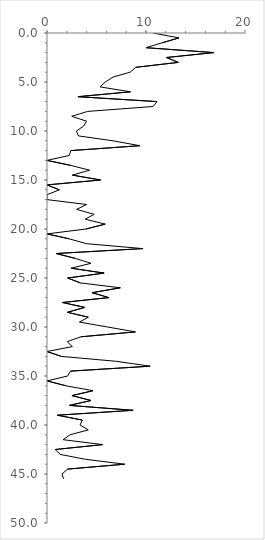
| Category | Series 0 |
|---|---|
| 10.695187165775401 | 0 |
| 13.333333333333334 | 0.5 |
| 11.627906976744185 | 1 |
| 10.0 | 1.5 |
| 16.867469879518072 | 2 |
| 12.068965517241379 | 2.5 |
| 13.26530612244898 | 3 |
| 8.974358974358974 | 3.5 |
| 8.396946564885496 | 4 |
| 6.666666666666667 | 4.5 |
| 5.88235294117647 | 5 |
| 5.357142857142857 | 5.5 |
| 8.433734939759036 | 6 |
| 3.125 | 6.5 |
| 11.11111111111111 | 7 |
| 10.714285714285714 | 7.5 |
| 4.10958904109589 | 8 |
| 2.5 | 8.5 |
| 4.0 | 9 |
| 3.7037037037037033 | 9.5 |
| 2.9702970297029703 | 10 |
| 3.1746031746031744 | 10.5 |
| 6.666666666666667 | 11 |
| 9.375 | 11.5 |
| 2.4096385542168677 | 12 |
| 2.247191011235955 | 12.5 |
| 0.0 | 13 |
| 2.3529411764705883 | 13.5 |
| 4.310344827586207 | 14 |
| 2.564102564102564 | 14.5 |
| 5.405405405405405 | 15 |
| 0.0 | 15.5 |
| 1.25 | 16 |
| 0.0 | 16.5 |
| 0.0 | 17 |
| 4.0 | 17.5 |
| 2.9850746268656714 | 18 |
| 4.761904761904762 | 18.5 |
| 3.8461538461538463 | 19 |
| 5.88235294117647 | 19.5 |
| 3.937007874015748 | 20 |
| 0.0 | 20.5 |
| 2.2222222222222223 | 21 |
| 4.0 | 21.5 |
| 9.67741935483871 | 22 |
| 0.9259259259259258 | 22.5 |
| 2.857142857142857 | 23 |
| 4.444444444444445 | 23.5 |
| 2.4390243902439024 | 24 |
| 5.769230769230769 | 24.5 |
| 2.083333333333333 | 25 |
| 3.3707865168539324 | 25.5 |
| 7.4074074074074066 | 26 |
| 4.545454545454546 | 26.5 |
| 6.25 | 27 |
| 1.5625 | 27.5 |
| 3.8095238095238098 | 28 |
| 2.0689655172413794 | 28.5 |
| 4.166666666666666 | 29 |
| 3.278688524590164 | 29.5 |
| 6.122448979591836 | 30 |
| 8.928571428571429 | 30.5 |
| 3.4090909090909087 | 31 |
| 2.0408163265306123 | 31.5 |
| 2.564102564102564 | 32 |
| 0.0 | 32.5 |
| 1.4492753623188406 | 33 |
| 7.000000000000001 | 33.5 |
| 10.416666666666668 | 34 |
| 2.380952380952381 | 34.5 |
| 2.083333333333333 | 35 |
| 0.0 | 35.5 |
| 1.9230769230769231 | 36 |
| 4.651162790697675 | 36.5 |
| 2.5210084033613445 | 37 |
| 4.444444444444445 | 37.5 |
| 2.2556390977443606 | 38 |
| 8.695652173913043 | 38.5 |
| 1.0526315789473684 | 39 |
| 3.571428571428571 | 39.5 |
| 3.3333333333333335 | 40 |
| 4.166666666666666 | 40.5 |
| 2.3255813953488373 | 41 |
| 1.6260162601626018 | 41.5 |
| 5.633802816901409 | 42 |
| 0.8264462809917356 | 42.5 |
| 1.3333333333333335 | 43 |
| 3.8834951456310676 | 43.5 |
| 7.8431372549019605 | 44 |
| 2.083333333333333 | 44.5 |
| 1.5151515151515151 | 45 |
| 1.6666666666666667 | 45.5 |